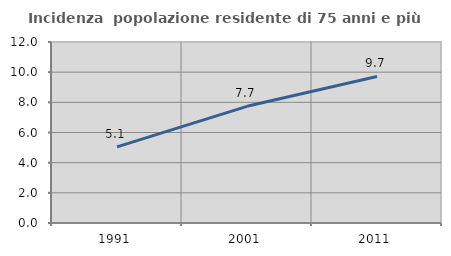
| Category | Incidenza  popolazione residente di 75 anni e più |
|---|---|
| 1991.0 | 5.051 |
| 2001.0 | 7.735 |
| 2011.0 | 9.715 |